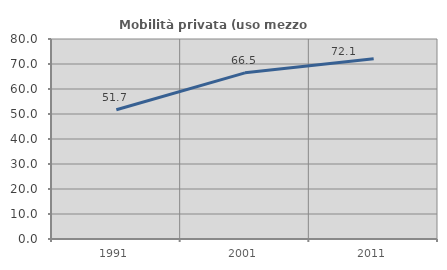
| Category | Mobilità privata (uso mezzo privato) |
|---|---|
| 1991.0 | 51.678 |
| 2001.0 | 66.469 |
| 2011.0 | 72.076 |